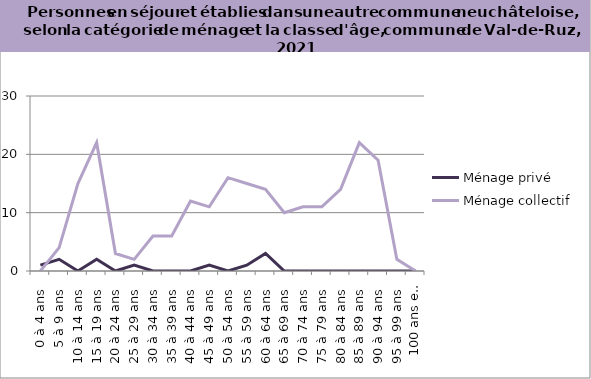
| Category | Ménage privé | Ménage collectif |
|---|---|---|
| 0 à 4 ans | 1 | 0 |
| 5 à 9 ans | 2 | 4 |
| 10 à 14 ans | 0 | 15 |
| 15 à 19 ans | 2 | 22 |
| 20 à 24 ans | 0 | 3 |
| 25 à 29 ans | 1 | 2 |
| 30 à 34 ans | 0 | 6 |
| 35 à 39 ans | 0 | 6 |
| 40 à 44 ans | 0 | 12 |
| 45 à 49 ans | 1 | 11 |
| 50 à 54 ans | 0 | 16 |
| 55 à 59 ans | 1 | 15 |
| 60 à 64 ans | 3 | 14 |
| 65 à 69 ans | 0 | 10 |
| 70 à 74 ans | 0 | 11 |
| 75 à 79 ans | 0 | 11 |
| 80 à 84 ans | 0 | 14 |
| 85 à 89 ans | 0 | 22 |
| 90 à 94 ans | 0 | 19 |
| 95 à 99 ans | 0 | 2 |
| 100 ans et plus | 0 | 0 |